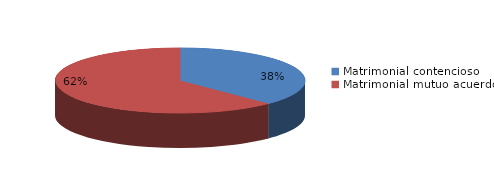
| Category | Series 0 |
|---|---|
| 0 | 450 |
| 1 | 749 |